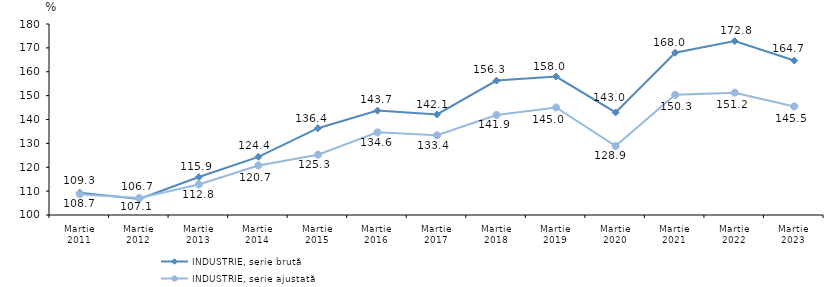
| Category | INDUSTRIE, serie brută | INDUSTRIE, serie ajustată |
|---|---|---|
| Martie
2011 | 109.348 | 108.742 |
| Martie
2012 | 106.694 | 107.144 |
| Martie
2013 | 115.89 | 112.805 |
| Martie
2014 | 124.367 | 120.748 |
| Martie
2015 | 136.357 | 125.263 |
| Martie
2016 | 143.718 | 134.607 |
| Martie
2017 | 142.119 | 133.381 |
| Martie
2018 | 156.295 | 141.909 |
| Martie
2019 | 157.994 | 145.039 |
| Martie
2020 | 142.962 | 128.908 |
| Martie
2021 | 167.979 | 150.336 |
| Martie
2022 | 172.828 | 151.229 |
| Martie
2023 | 164.698 | 145.477 |